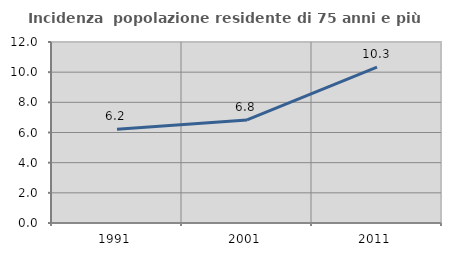
| Category | Incidenza  popolazione residente di 75 anni e più |
|---|---|
| 1991.0 | 6.212 |
| 2001.0 | 6.832 |
| 2011.0 | 10.33 |